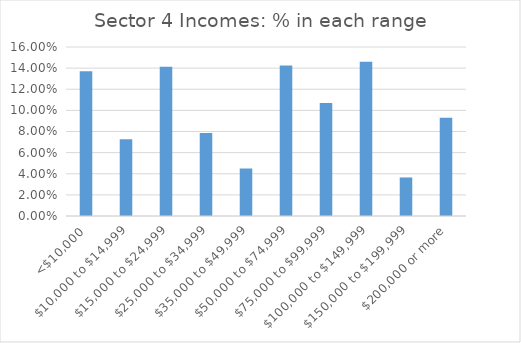
| Category | Series 0 |
|---|---|
| <$10,000 | 0.137 |
| $10,000 to $14,999 | 0.073 |
| $15,000 to $24,999 | 0.141 |
| $25,000 to $34,999 | 0.079 |
| $35,000 to $49,999 | 0.045 |
| $50,000 to $74,999 | 0.142 |
| $75,000 to $99,999 | 0.107 |
| $100,000 to $149,999 | 0.146 |
| $150,000 to $199,999 | 0.036 |
| $200,000 or more | 0.093 |